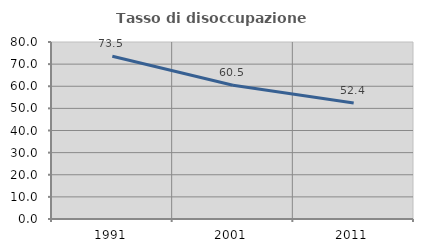
| Category | Tasso di disoccupazione giovanile  |
|---|---|
| 1991.0 | 73.545 |
| 2001.0 | 60.484 |
| 2011.0 | 52.381 |